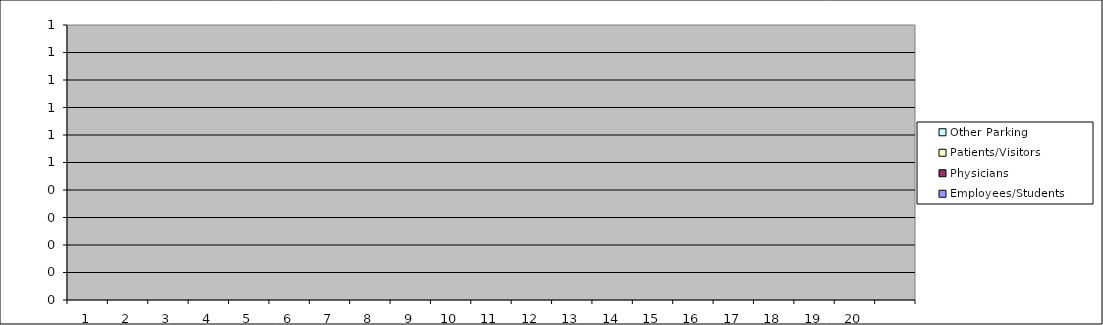
| Category | Employees/Students | Physicians | Patients/Visitors | Other Parking  |
|---|---|---|---|---|
| 1.0 | 0 | 0 | 0 | 0 |
| 2.0 | 0 | 0 | 0 | 0 |
| 3.0 | 0 | 0 | 0 | 0 |
| 4.0 | 0 | 0 | 0 | 0 |
| 5.0 | 0 | 0 | 0 | 0 |
| 6.0 | 0 | 0 | 0 | 0 |
| 7.0 | 0 | 0 | 0 | 0 |
| 8.0 | 0 | 0 | 0 | 0 |
| 9.0 | 0 | 0 | 0 | 0 |
| 10.0 | 0 | 0 | 0 | 0 |
| 11.0 | 0 | 0 | 0 | 0 |
| 12.0 | 0 | 0 | 0 | 0 |
| 13.0 | 0 | 0 | 0 | 0 |
| 14.0 | 0 | 0 | 0 | 0 |
| 15.0 | 0 | 0 | 0 | 0 |
| 16.0 | 0 | 0 | 0 | 0 |
| 17.0 | 0 | 0 | 0 | 0 |
| 18.0 | 0 | 0 | 0 | 0 |
| 19.0 | 0 | 0 | 0 | 0 |
| 20.0 | 0 | 0 | 0 | 0 |